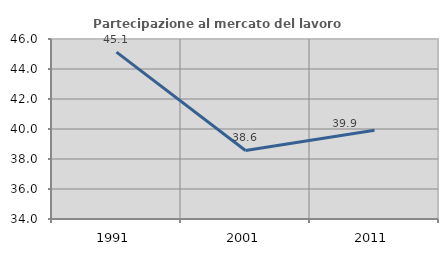
| Category | Partecipazione al mercato del lavoro  femminile |
|---|---|
| 1991.0 | 45.123 |
| 2001.0 | 38.568 |
| 2011.0 | 39.917 |